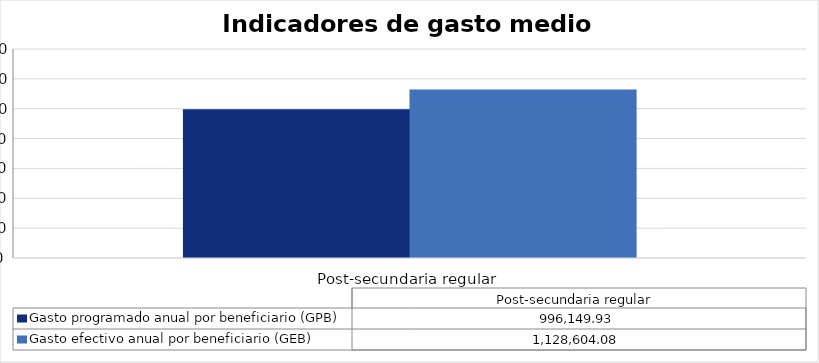
| Category | Gasto programado anual por beneficiario (GPB)  | Gasto efectivo anual por beneficiario (GEB)  |
|---|---|---|
| Post-secundaria regular  | 996149.928 | 1128604.075 |